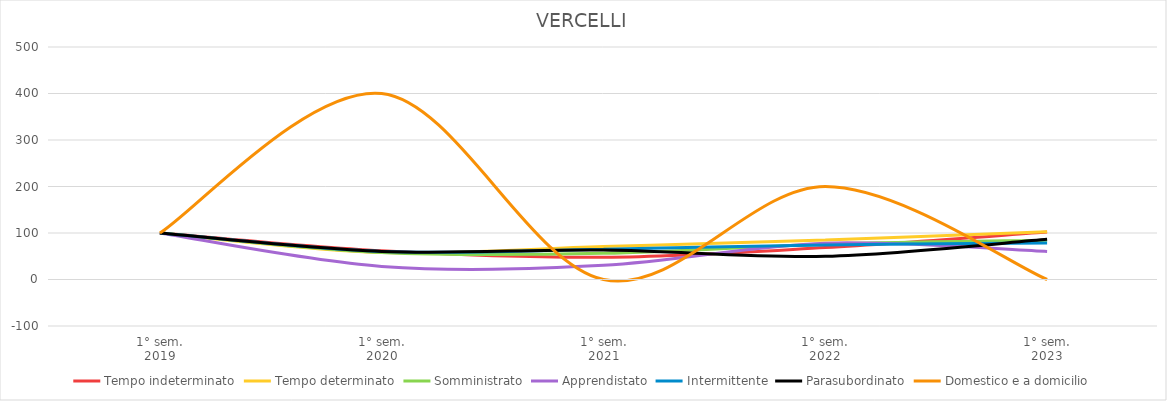
| Category | Tempo indeterminato | Tempo determinato | Somministrato | Apprendistato | Intermittente | Parasubordinato | Domestico e a domicilio |
|---|---|---|---|---|---|---|---|
| 1° sem.
2019 | 100 | 100 | 100 | 100 | 100 | 100 | 100 |
| 1° sem.
2020 | 61.806 | 58.018 | 58.084 | 28.205 | 60.201 | 60.417 | 400 |
| 1° sem.
2021 | 47.917 | 70.926 | 56.287 | 30.769 | 65.086 | 63.542 | 0 |
| 1° sem.
2022 | 68.75 | 84.876 | 76.048 | 78.205 | 74.425 | 50 | 200 |
| 1° sem.
2023 | 102.083 | 102.738 | 84.431 | 60.256 | 78.305 | 86.458 | 0 |